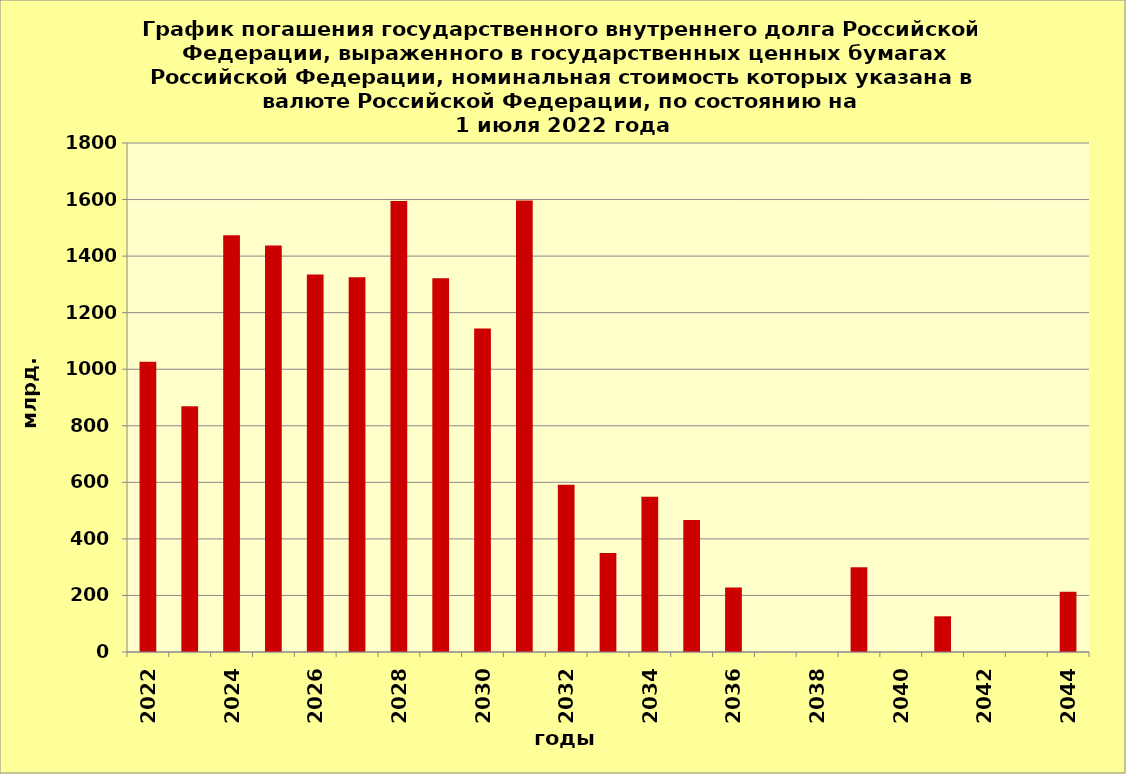
| Category | ряд 1 |
|---|---|
| 2022.0 | 1026.435 |
| 2023.0 | 869.417 |
| 2024.0 | 1473.45 |
| 2025.0 | 1437.75 |
| 2026.0 | 1334.561 |
| 2027.0 | 1324.833 |
| 2028.0 | 1595.301 |
| 2029.0 | 1321.585 |
| 2030.0 | 1143.686 |
| 2031.0 | 1596.903 |
| 2032.0 | 591.232 |
| 2033.0 | 350 |
| 2034.0 | 548.84 |
| 2035.0 | 467.105 |
| 2036.0 | 227.812 |
| 2037.0 | 0 |
| 2038.0 | 0 |
| 2039.0 | 300 |
| 2040.0 | 0 |
| 2041.0 | 126.269 |
| 2042.0 | 0 |
| 2043.0 | 0 |
| 2044.0 | 212.636 |